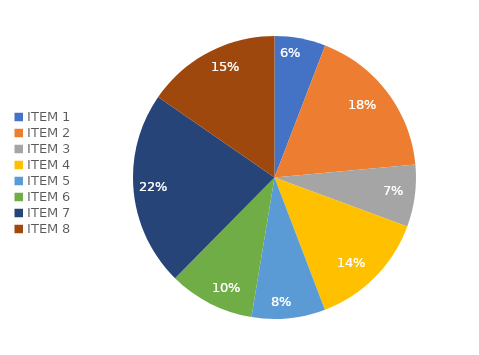
| Category | Series 0 | Series 1 |
|---|---|---|
| ITEM 1 | 0.058 | 0.058 |
| ITEM 2 | 0.177 | 0.177 |
| ITEM 3 | 0.071 | 0.071 |
| ITEM 4 | 0.136 | 0.136 |
| ITEM 5 | 0.084 | 0.084 |
| ITEM 6 | 0.098 | 0.098 |
| ITEM 7 | 0.222 | 0.222 |
| ITEM 8 | 0.154 | 0.154 |